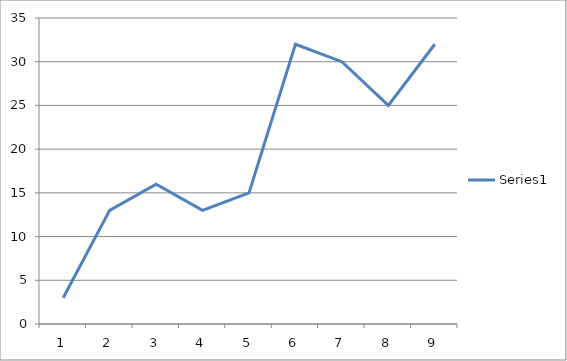
| Category | Series 0 |
|---|---|
| 0 | 3 |
| 1 | 13 |
| 2 | 16 |
| 3 | 13 |
| 4 | 15 |
| 5 | 32 |
| 6 | 30 |
| 7 | 25 |
| 8 | 32 |